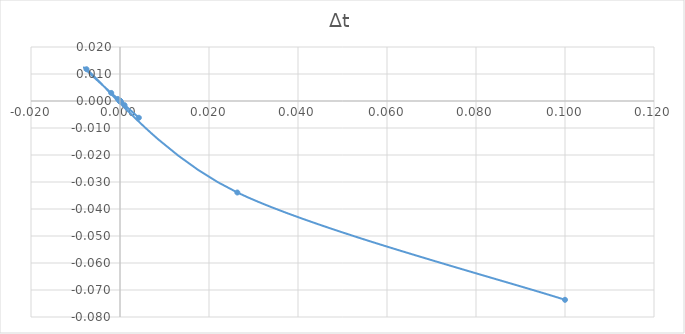
| Category | Δt |
|---|---|
| 0.1 | -0.074 |
| 0.026363636363636367 | -0.034 |
| -0.007525273205382148 | 0.012 |
| 0.004236598646937689 | -0.006 |
| -0.001969516673358213 | 0.003 |
| 0.001017076619253988 | -0.002 |
| -0.0004999407827635523 | 0.001 |
| 0.000252050296255699 | 0 |
| -0.0001254968086051949 | 0 |
| 6.287942455884127e-05 | 0 |
| -3.1406825363970465e-05 | 0 |
| 1.571161785358699e-05 | 0 |
| -7.8537555690009e-06 | 0 |
| 3.9273908655400446e-06 | 0 |
| -1.9635671302276436e-06 | 0 |
| 9.818156367129451e-07 | 0 |
| -4.908997999522055e-07 | 0 |
| 2.4545190451410415e-07 | 0 |
| -1.2272545111466884e-07 | 0 |
| 6.136285084194488e-08 | 0 |
| -3.068139409969667e-08 | 0 |
| 1.534070488015188e-08 | 0 |
| -7.670350482498128e-09 | 0 |
| 3.835175730643275e-09 | 0 |
| -1.9175877429730547e-09 | 0 |
| 9.587939020736692e-10 | 0 |
| -4.793969433900486e-10 | 0 |
| 2.396984736067207e-10 | 0 |
| -1.1984923632543622e-10 | 0 |
| 5.992461828219916e-11 | 0 |
| -2.996230911122931e-11 | 0 |